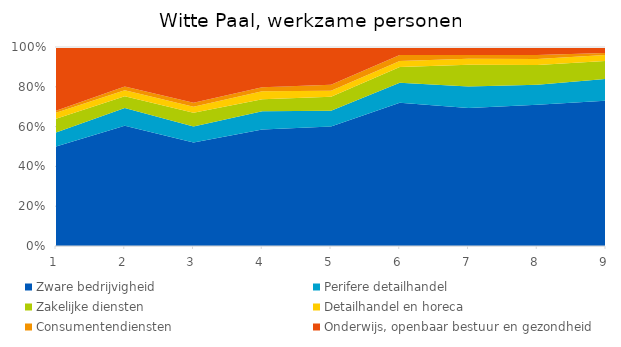
| Category | Zware bedrijvigheid | Perifere detailhandel | Zakelijke diensten | Detailhandel en horeca | Consumentendiensten | Onderwijs, openbaar bestuur en gezondheid |
|---|---|---|---|---|---|---|
| 0 | 0.5 | 0.07 | 0.07 | 0.03 | 0.01 | 0.32 |
| 1 | 0.61 | 0.09 | 0.06 | 0.03 | 0.02 | 0.2 |
| 2 | 0.52 | 0.08 | 0.07 | 0.03 | 0.02 | 0.28 |
| 3 | 0.58 | 0.09 | 0.06 | 0.04 | 0.02 | 0.2 |
| 4 | 0.6 | 0.08 | 0.07 | 0.03 | 0.03 | 0.19 |
| 5 | 0.72 | 0.1 | 0.08 | 0.03 | 0.03 | 0.04 |
| 6 | 0.7 | 0.11 | 0.11 | 0.03 | 0.02 | 0.04 |
| 7 | 0.71 | 0.1 | 0.1 | 0.03 | 0.02 | 0.04 |
| 8 | 0.73 | 0.11 | 0.09 | 0.03 | 0.01 | 0.03 |